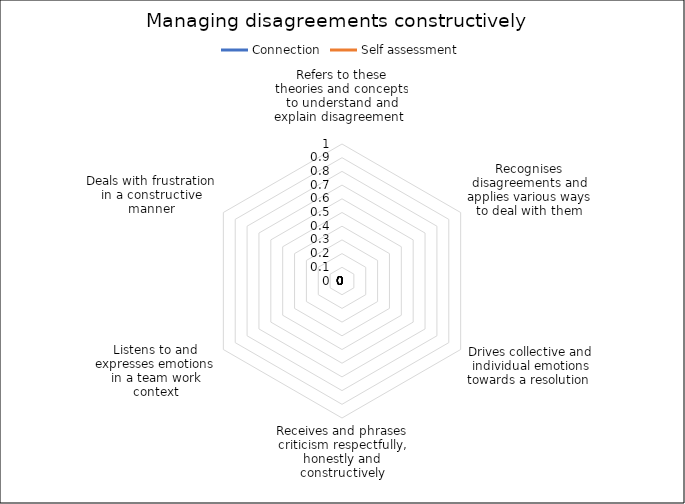
| Category | Connection | Self assessment |
|---|---|---|
| Refers to these theories and concepts to understand and explain disagreement  | 0 | 0 |
| Recognises disagreements and applies various ways to deal with them | 0 | 0 |
| Drives collective and individual emotions towards a resolution  | 0 | 0 |
| Receives and phrases criticism respectfully, honestly and constructively | 0 | 0 |
| Listens to and expresses emotions in a team work context | 0 | 0 |
| Deals with frustration in a constructive manner | 0 | 0 |